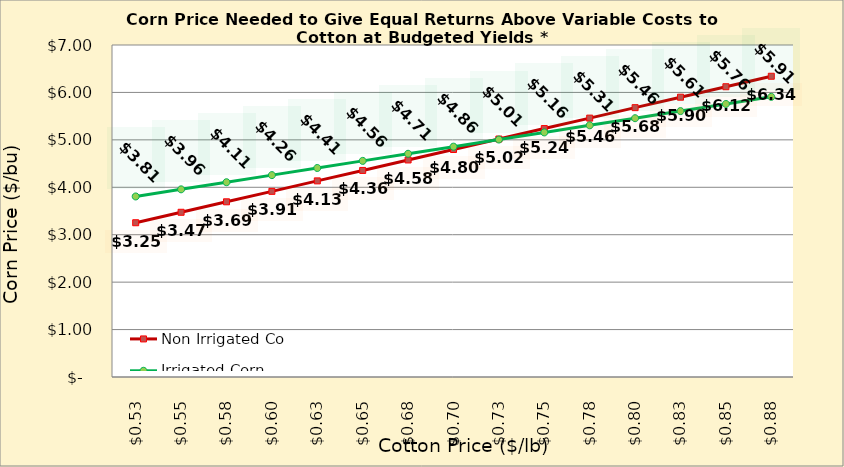
| Category | Non Irrigated Corn | Irrigated Corn |
|---|---|---|
| 0.5249999999999998 | 3.253 | 3.807 |
| 0.5499999999999998 | 3.473 | 3.957 |
| 0.5749999999999998 | 3.694 | 4.107 |
| 0.5999999999999999 | 3.914 | 4.257 |
| 0.6249999999999999 | 4.135 | 4.407 |
| 0.6499999999999999 | 4.356 | 4.557 |
| 0.6749999999999999 | 4.576 | 4.707 |
| 0.7 | 4.797 | 4.857 |
| 0.725 | 5.017 | 5.007 |
| 0.75 | 5.238 | 5.157 |
| 0.775 | 5.458 | 5.307 |
| 0.8 | 5.679 | 5.457 |
| 0.8250000000000001 | 5.9 | 5.607 |
| 0.8500000000000001 | 6.12 | 5.757 |
| 0.8750000000000001 | 6.341 | 5.907 |